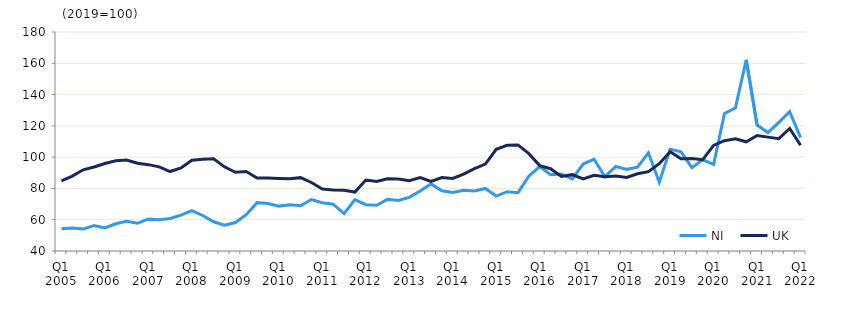
| Category | NI | UK  |
|---|---|---|
| Q1 2005 | 54.2 | 84.9 |
|  | 54.7 | 87.9 |
| Q3 2005 | 54 | 91.9 |
|  | 56.3 | 93.7 |
| Q1 2006 | 54.8 | 95.9 |
|  | 57.4 | 97.7 |
| Q3 2006 | 59 | 98.2 |
|  | 57.7 | 96.1 |
| Q1 2007 | 60.5 | 95.2 |
|  | 60 | 93.8 |
| Q3 2007 | 60.8 | 90.8 |
|  | 62.9 | 93.1 |
| Q1 2008 | 65.8 | 98 |
|  | 62.7 | 98.7 |
| Q3 2008 | 58.7 | 99 |
|  | 56.5 | 93.8 |
| Q1 2009 | 58.2 | 90.3 |
|  | 63.2 | 90.8 |
| Q3 2009 | 70.9 | 86.6 |
|  | 70.3 | 86.6 |
| Q1 2010 | 68.7 | 86.4 |
|  | 69.6 | 86.2 |
| Q3 2010 | 68.9 | 86.9 |
|  | 72.9 | 83.8 |
| Q1 2011 | 70.9 | 79.6 |
|  | 69.9 | 79 |
| Q3 2011 | 63.9 | 78.9 |
|  | 72.9 | 77.7 |
| Q1 2012 | 69.6 | 85.4 |
|  | 69.2 | 84.4 |
| Q3 2012 | 73 | 86.2 |
|  | 72.3 | 86 |
| Q1 2013 | 74.3 | 84.9 |
|  | 78.4 | 87 |
| Q3 2013 | 82.9 | 84.5 |
|  | 78.5 | 87 |
| Q1 2014 | 77.4 | 86.4 |
|  | 78.8 | 89.2 |
| Q3 2014 | 78.4 | 92.7 |
|  | 80 | 95.6 |
| Q1 2015 | 75.1 | 105 |
|  | 77.9 | 107.6 |
| Q3 2015 | 77.3 | 107.8 |
|  | 87.8 | 102.2 |
| Q1 2016 | 94 | 94.6 |
|  | 88.8 | 92.6 |
| Q3 2016 | 89.2 | 87.7 |
|  | 86.1 | 88.8 |
| Q1 2017 | 95.6 | 86.1 |
|  | 98.7 | 88.4 |
| Q3 2017 | 87.5 | 87.5 |
|  | 94 | 88 |
| Q1 2018 | 92.2 | 87 |
|  | 93.6 | 89.4 |
| Q3 2018 | 102.8 | 90.7 |
|  | 84 | 95.8 |
| Q1 2019 | 105.1 | 103.5 |
|  | 103.4 | 99 |
| Q3 2019 | 93.3 | 99.1 |
|  | 98.3 | 98.4 |
| Q1 2020 | 95.3 | 107.5 |
|  | 127.9 | 110.5 |
| Q3 2020 | 131.4 | 111.8 |
|  | 162.2 | 109.8 |
| Q1 2021 | 120.5 | 113.8 |
|  | 115.7 | 112.8 |
| Q3 2021 | 122.2 | 111.8 |
|  | 129.1 | 118.3 |
| Q1 2022 | 112.5 | 107.6 |